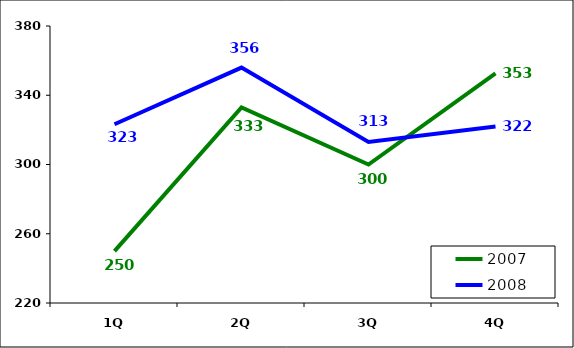
| Category | 2007 | 2008 |
|---|---|---|
| 1Q | 250 | 323.251 |
| 2Q | 333 | 356 |
| 3Q | 300 | 313 |
| 4Q | 352.7 | 322 |